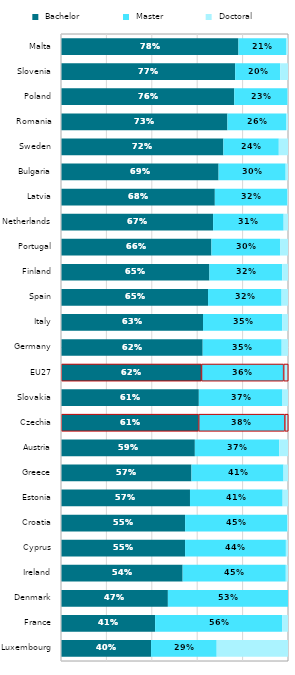
| Category |  Bachelor |  Master |  Doctoral |
|---|---|---|---|
| Luxembourg | 0.397 | 0.289 | 0.314 |
| France | 0.415 | 0.559 | 0.026 |
| Denmark | 0.471 | 0.529 | 0 |
| Ireland | 0.536 | 0.454 | 0.01 |
| Cyprus | 0.547 | 0.444 | 0.009 |
| Croatia | 0.547 | 0.449 | 0.004 |
| Estonia | 0.568 | 0.408 | 0.024 |
| Greece | 0.575 | 0.406 | 0.02 |
| Austria | 0.59 | 0.372 | 0.039 |
| Czechia | 0.605 | 0.379 | 0.015 |
| Slovakia | 0.607 | 0.368 | 0.024 |
| EU27 | 0.618 | 0.362 | 0.02 |
| Germany | 0.624 | 0.348 | 0.028 |
| Italy | 0.626 | 0.349 | 0.026 |
| Spain | 0.648 | 0.324 | 0.028 |
| Finland | 0.654 | 0.321 | 0.025 |
| Portugal | 0.663 | 0.302 | 0.035 |
| Netherlands | 0.67 | 0.311 | 0.019 |
| Latvia | 0.678 | 0.319 | 0.003 |
| Bulgaria | 0.694 | 0.296 | 0.01 |
| Sweden | 0.715 | 0.244 | 0.041 |
| Romania | 0.733 | 0.258 | 0.009 |
| Poland | 0.763 | 0.235 | 0.002 |
| Slovenia | 0.767 | 0.198 | 0.034 |
| Malta | 0.782 | 0.209 | 0.009 |